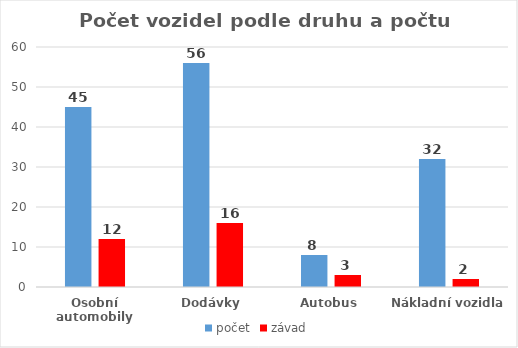
| Category | počet | závad |
|---|---|---|
| Osobní automobily | 45 | 12 |
| Dodávky | 56 | 16 |
| Autobus | 8 | 3 |
| Nákladní vozidla | 32 | 2 |